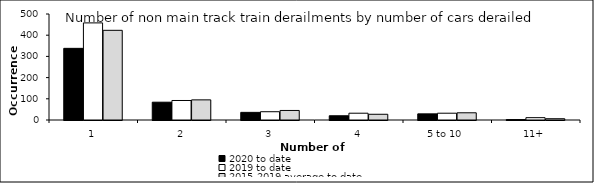
| Category | 2020 to date | 2019 to date | 2015-2019 average to date |
|---|---|---|---|
| 1 | 338 | 458 | 423 |
| 2 | 84 | 92 | 95 |
| 3 | 36 | 39 | 45 |
| 4 | 20 | 32 | 27 |
| 5 to 10 | 29 | 32 | 34 |
| 11+ | 2 | 11 | 6 |